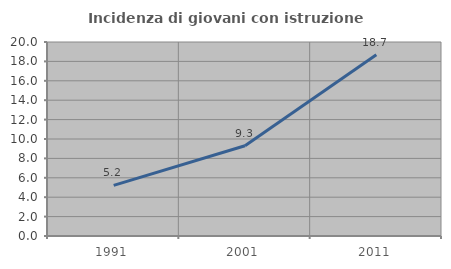
| Category | Incidenza di giovani con istruzione universitaria |
|---|---|
| 1991.0 | 5.215 |
| 2001.0 | 9.304 |
| 2011.0 | 18.686 |